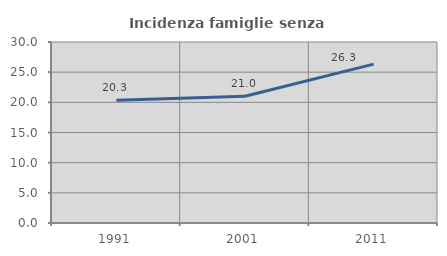
| Category | Incidenza famiglie senza nuclei |
|---|---|
| 1991.0 | 20.349 |
| 2001.0 | 20.997 |
| 2011.0 | 26.331 |